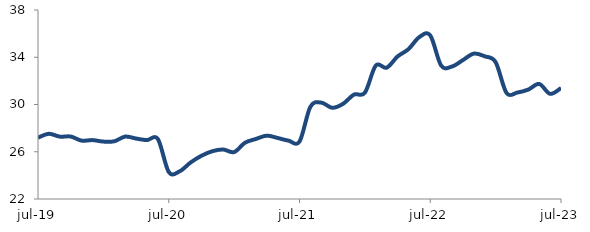
| Category | Series 0 |
|---|---|
| 2019-07-01 | 27.194 |
| 2019-08-01 | 27.519 |
| 2019-09-01 | 27.279 |
| 2019-10-01 | 27.289 |
| 2019-11-01 | 26.942 |
| 2019-12-01 | 26.986 |
| 2020-01-01 | 26.86 |
| 2020-02-01 | 26.885 |
| 2020-03-01 | 27.282 |
| 2020-04-01 | 27.118 |
| 2020-05-01 | 26.986 |
| 2020-06-01 | 27.082 |
| 2020-07-01 | 24.291 |
| 2020-08-01 | 24.343 |
| 2020-09-01 | 25.089 |
| 2020-10-01 | 25.658 |
| 2020-11-01 | 26.044 |
| 2020-12-01 | 26.188 |
| 2021-01-01 | 25.972 |
| 2021-02-01 | 26.764 |
| 2021-03-01 | 27.083 |
| 2021-04-01 | 27.363 |
| 2021-05-01 | 27.164 |
| 2021-06-01 | 26.939 |
| 2021-07-01 | 26.864 |
| 2021-08-01 | 29.808 |
| 2021-09-01 | 30.158 |
| 2021-10-01 | 29.722 |
| 2021-11-01 | 30.058 |
| 2021-12-01 | 30.839 |
| 2022-01-01 | 30.999 |
| 2022-02-01 | 33.297 |
| 2022-03-01 | 33.114 |
| 2022-04-01 | 34.066 |
| 2022-05-01 | 34.685 |
| 2022-06-01 | 35.71 |
| 2022-07-01 | 35.85 |
| 2022-08-01 | 33.294 |
| 2022-09-01 | 33.218 |
| 2022-10-01 | 33.762 |
| 2022-11-01 | 34.307 |
| 2022-12-01 | 34.079 |
| 2023-01-01 | 33.585 |
| 2023-02-01 | 30.978 |
| 2023-03-01 | 31.014 |
| 2023-04-01 | 31.263 |
| 2023-05-01 | 31.74 |
| 2023-06-01 | 30.902 |
| 2023-07-01 | 31.392 |